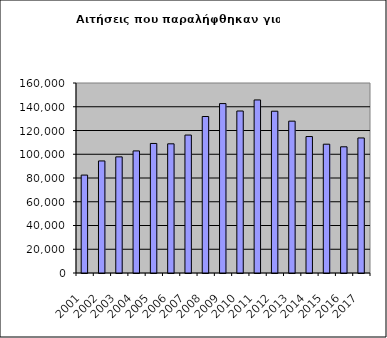
| Category | Series 0 |
|---|---|
| 2001.0 | 82454 |
| 2002.0 | 94358 |
| 2003.0 | 97793 |
| 2004.0 | 102813 |
| 2005.0 | 109089 |
| 2006.0 | 108785 |
| 2007.0 | 116159 |
| 2008.0 | 131779 |
| 2009.0 | 142663 |
| 2010.0 | 136417 |
| 2011.0 | 145734 |
| 2012.0 | 136250 |
| 2013.0 | 127876 |
| 2014.0 | 114913 |
| 2015.0 | 108465 |
| 2016.0 | 106273 |
| 2017.0 | 113720 |